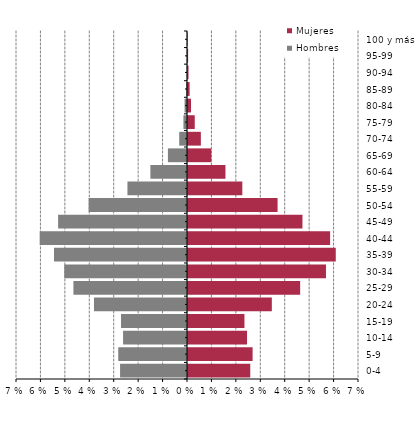
| Category | Hombres | Mujeres |
|---|---|---|
| 0-4 | -0.027 | 0.025 |
| 5-9 | -0.028 | 0.026 |
| 10-14 | -0.026 | 0.024 |
| 15-19 | -0.027 | 0.023 |
| 20-24 | -0.038 | 0.034 |
| 25-29 | -0.046 | 0.046 |
| 30-34 | -0.05 | 0.056 |
| 35-39 | -0.054 | 0.06 |
| 40-44 | -0.06 | 0.058 |
| 45-49 | -0.053 | 0.047 |
| 50-54 | -0.04 | 0.037 |
| 55-59 | -0.024 | 0.022 |
| 60-64 | -0.015 | 0.015 |
| 65-69 | -0.008 | 0.01 |
| 70-74 | -0.003 | 0.005 |
| 75-79 | -0.001 | 0.003 |
| 80-84 | -0.001 | 0.001 |
| 85-89 | 0 | 0.001 |
| 90-94 | 0 | 0 |
| 95-99 | 0 | 0 |
| 100 y más | 0 | 0 |